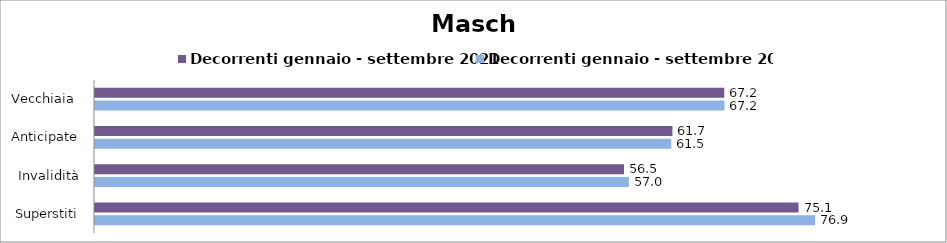
| Category | Decorrenti gennaio - settembre 2021 | Decorrenti gennaio - settembre 2022 |
|---|---|---|
| Vecchiaia  | 67.18 | 67.2 |
| Anticipate | 61.65 | 61.52 |
| Invalidità | 56.48 | 57 |
| Superstiti | 75.11 | 76.88 |